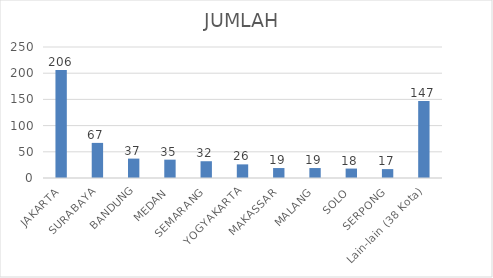
| Category | JUMLAH  |
|---|---|
| JAKARTA | 206 |
| SURABAYA | 67 |
| BANDUNG | 37 |
| MEDAN | 35 |
| SEMARANG | 32 |
| YOGYAKARTA | 26 |
| MAKASSAR | 19 |
| MALANG | 19 |
| SOLO | 18 |
| SERPONG | 17 |
| Lain-lain (38 Kota) | 147 |